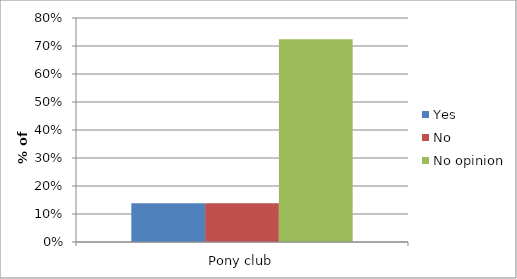
| Category | Yes | No | No opinion |
|---|---|---|---|
| Pony club | 0.138 | 0.138 | 0.724 |